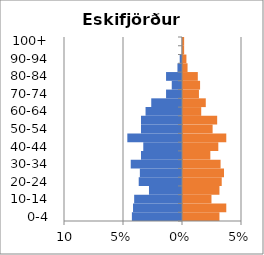
| Category | % Men | % Women |
|---|---|---|
| 0-4 | -0.042 | 0.031 |
| 5-9 | -0.042 | 0.037 |
| 10-14 | -0.041 | 0.024 |
| 15-19 | -0.028 | 0.031 |
| 20-24 | -0.037 | 0.033 |
| 25-29 | -0.036 | 0.035 |
| 30-34 | -0.043 | 0.032 |
| 35-39 | -0.035 | 0.023 |
| 40-44 | -0.033 | 0.03 |
| 45-49 | -0.046 | 0.037 |
| 50-54 | -0.035 | 0.025 |
| 55-59 | -0.035 | 0.029 |
| 60-64 | -0.031 | 0.015 |
| 65-69 | -0.026 | 0.019 |
| 70-74 | -0.014 | 0.014 |
| 75-79 | -0.009 | 0.014 |
| 80-84 | -0.014 | 0.013 |
| 85-89 | -0.004 | 0.004 |
| 90-94 | -0.002 | 0.003 |
| 95-99 | 0 | 0.001 |
| 100+ | 0 | 0.001 |